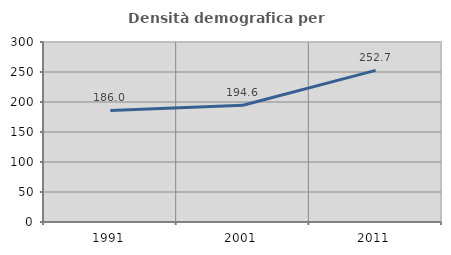
| Category | Densità demografica |
|---|---|
| 1991.0 | 185.99 |
| 2001.0 | 194.555 |
| 2011.0 | 252.677 |